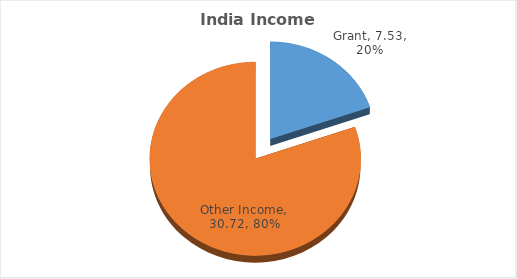
| Category | Series 1 |
|---|---|
| Grant | 7.53 |
| Other Income | 30.72 |